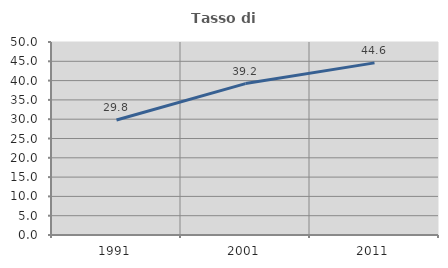
| Category | Tasso di occupazione   |
|---|---|
| 1991.0 | 29.775 |
| 2001.0 | 39.231 |
| 2011.0 | 44.59 |